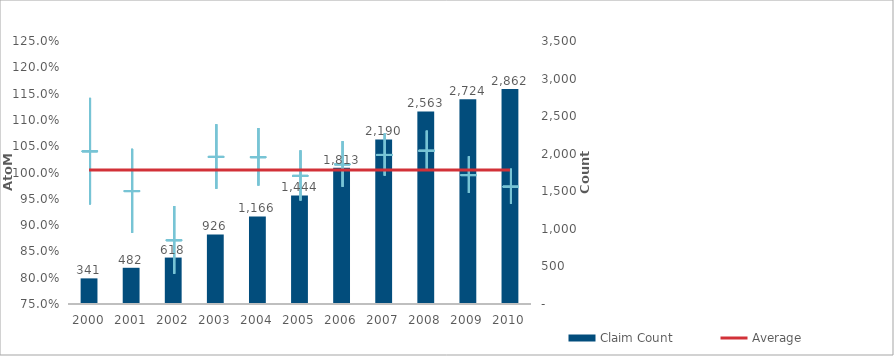
| Category | Claim Count |
|---|---|
| 0 | 341 |
| 1 | 482 |
| 2 | 618 |
| 3 | 926 |
| 4 | 1166 |
| 5 | 1444 |
| 6 | 1813 |
| 7 | 2190 |
| 8 | 2563 |
| 9 | 2724 |
| 10 | 2862 |